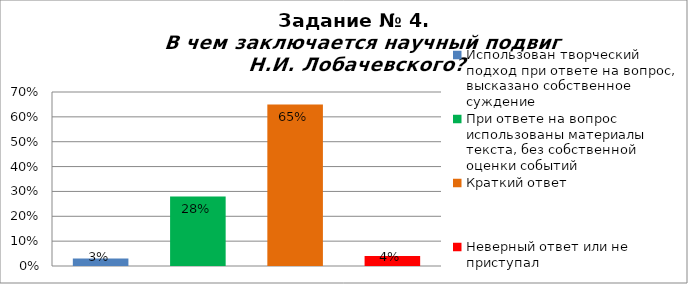
| Category | В чем заключается научный подвиг Н.И. Лобачевского? |
|---|---|
| Использован творческий подход при ответе на вопрос, высказано собственное суждение | 0.03 |
| При ответе на вопрос использованы материалы текста, без собственной оценки событий | 0.28 |
| Краткий ответ | 0.65 |
| Неверный ответ или не приступал | 0.04 |